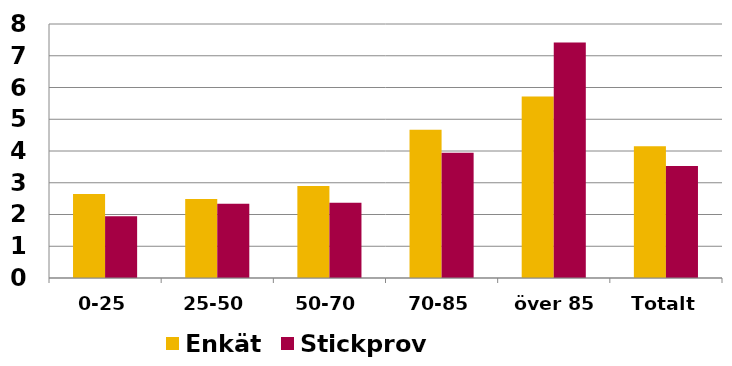
| Category | Enkät | Stickprov |
|---|---|---|
| 0-25 | 2.648 | 1.943 |
| 25-50 | 2.485 | 2.339 |
| 50-70 | 2.9 | 2.373 |
| 70-85 | 4.671 | 3.944 |
| över 85 | 5.714 | 7.415 |
| Totalt | 4.152 | 3.524 |